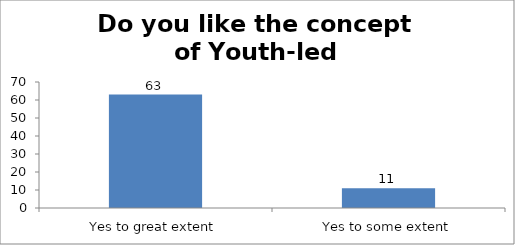
| Category | Do you like the concept of Youth-led Changemaking?  |
|---|---|
| Yes to great extent | 63 |
| Yes to some extent | 11 |